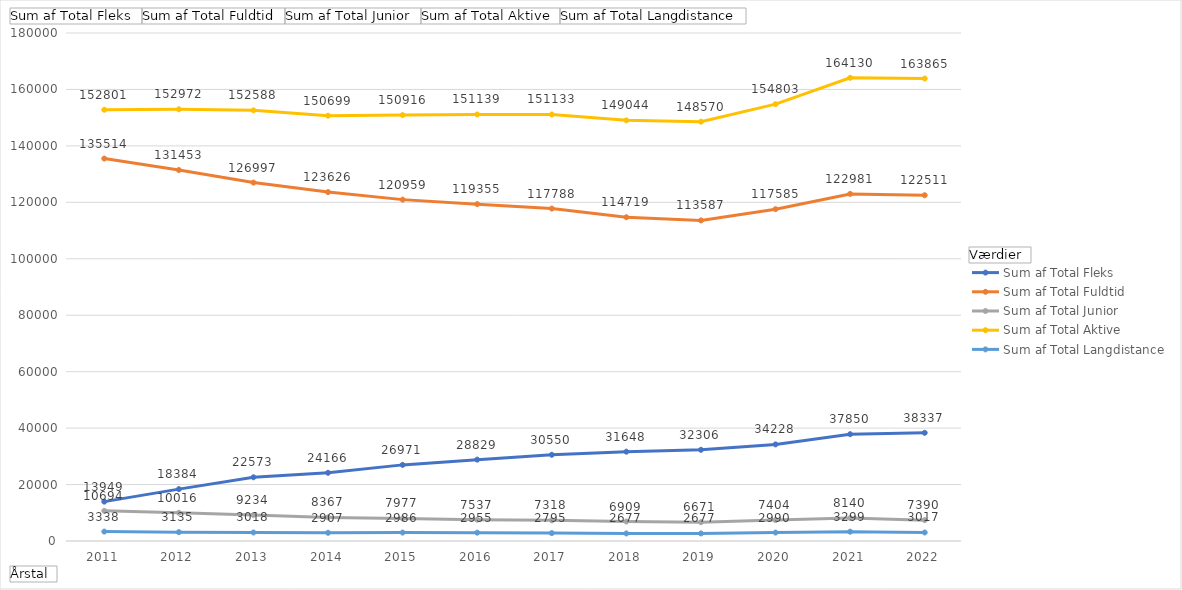
| Category | Sum af Total Fleks | Sum af Total Fuldtid | Sum af Total Junior | Sum af Total Aktive | Sum af Total Langdistance |
|---|---|---|---|---|---|
| 2011 | 13949 | 135514 | 10694 | 152801 | 3338 |
| 2012 | 18384 | 131453 | 10016 | 152972 | 3135 |
| 2013 | 22573 | 126997 | 9234 | 152588 | 3018 |
| 2014 | 24166 | 123626 | 8367 | 150699 | 2907 |
| 2015 | 26971 | 120959 | 7977 | 150916 | 2986 |
| 2016 | 28829 | 119355 | 7537 | 151139 | 2955 |
| 2017 | 30550 | 117788 | 7318 | 151133 | 2795 |
| 2018 | 31648 | 114719 | 6909 | 149044 | 2677 |
| 2019 | 32306 | 113587 | 6671 | 148570 | 2677 |
| 2020 | 34228 | 117585 | 7404 | 154803 | 2990 |
| 2021 | 37850 | 122981 | 8140 | 164130 | 3299 |
| 2022 | 38337 | 122511 | 7390 | 163865 | 3017 |